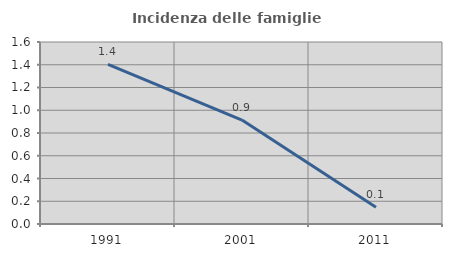
| Category | Incidenza delle famiglie numerose |
|---|---|
| 1991.0 | 1.403 |
| 2001.0 | 0.914 |
| 2011.0 | 0.147 |